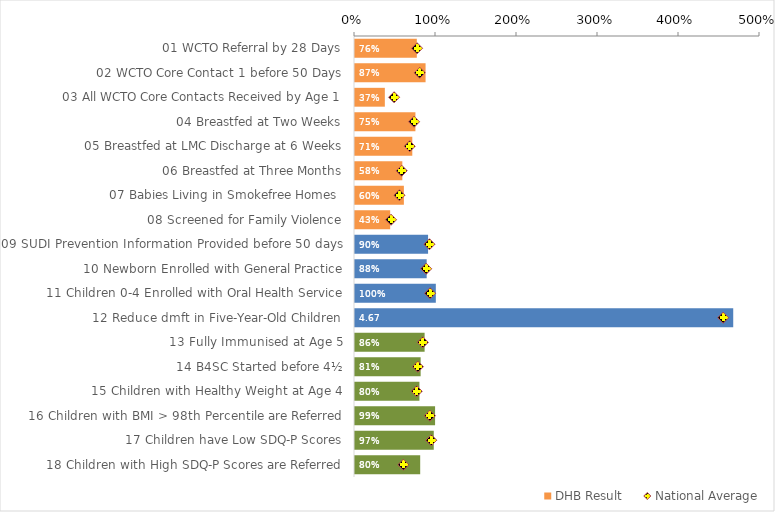
| Category | DHB Result |
|---|---|
| 01 WCTO Referral by 28 Days | 0.763 |
| 02 WCTO Core Contact 1 before 50 Days | 0.871 |
| 03 All WCTO Core Contacts Received by Age 1 | 0.368 |
| 04 Breastfed at Two Weeks | 0.746 |
| 05 Breastfed at LMC Discharge at 6 Weeks | 0.707 |
| 06 Breastfed at Three Months | 0.584 |
| 07 Babies Living in Smokefree Homes  | 0.603 |
| 08 Screened for Family Violence | 0.434 |
| 09 SUDI Prevention Information Provided before 50 days | 0.902 |
| 10 Newborn Enrolled with General Practice | 0.885 |
| 11 Children 0-4 Enrolled with Oral Health Service | 0.998 |
| 12 Reduce dmft in Five-Year-Old Children | 4.669 |
| 13 Fully Immunised at Age 5 | 0.859 |
| 14 B4SC Started before 4½ | 0.81 |
| 15 Children with Healthy Weight at Age 4 | 0.795 |
| 16 Children with BMI > 98th Percentile are Referred | 0.989 |
| 17 Children have Low SDQ-P Scores | 0.972 |
| 18 Children with High SDQ-P Scores are Referred | 0.805 |